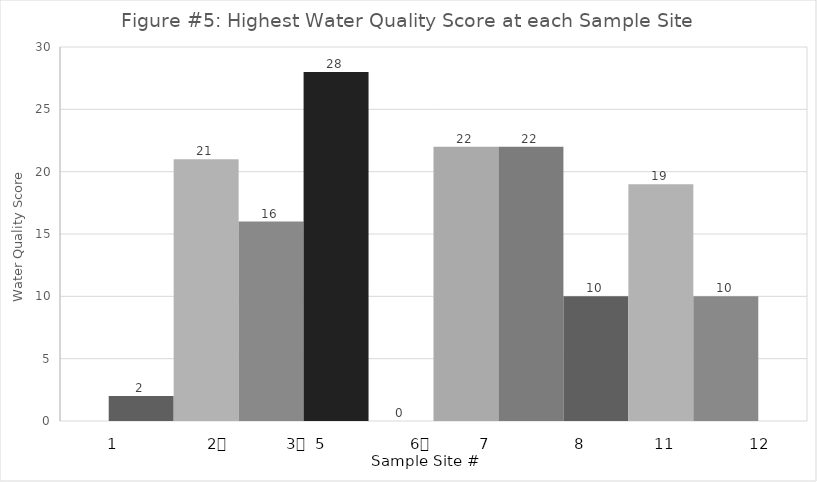
| Category | Series 0 | Series 1 | Series 2 | Series 3 | Series 4 | Series 5 | Series 6 | Series 7 | Series 8 | Series 9 |
|---|---|---|---|---|---|---|---|---|---|---|
| 0 | 2 | 21 | 16 | 28 | 0 | 22 | 22 | 10 | 19 | 10 |